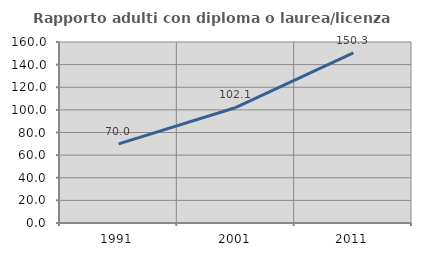
| Category | Rapporto adulti con diploma o laurea/licenza media  |
|---|---|
| 1991.0 | 69.974 |
| 2001.0 | 102.118 |
| 2011.0 | 150.291 |